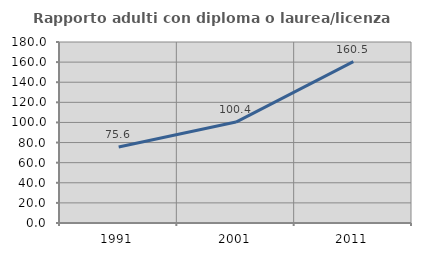
| Category | Rapporto adulti con diploma o laurea/licenza media  |
|---|---|
| 1991.0 | 75.629 |
| 2001.0 | 100.381 |
| 2011.0 | 160.503 |